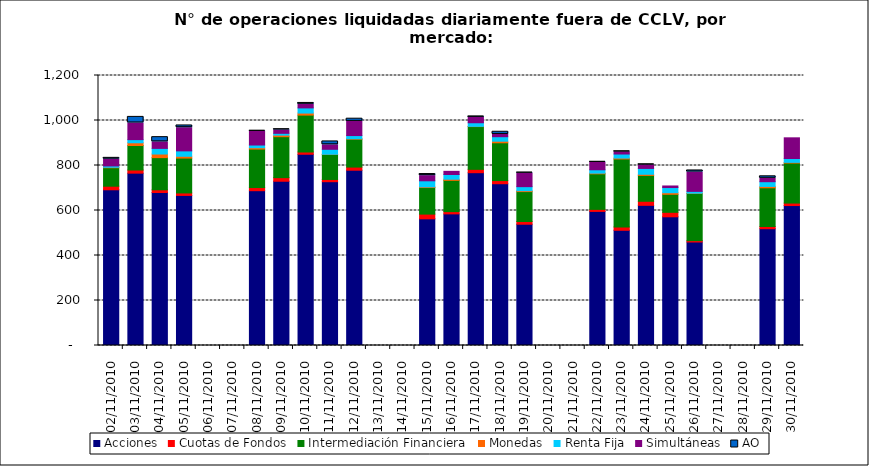
| Category | Acciones | Cuotas de Fondos | Intermediación Financiera | Monedas | Renta Fija | Simultáneas | AO |
|---|---|---|---|---|---|---|---|
| 02/11/2010 | 692 | 16 | 82 | 2 | 6 | 30 | 6 |
| 03/11/2010 | 766 | 14 | 109 | 12 | 14 | 74 | 27 |
| 04/11/2010 | 680 | 12 | 143 | 16 | 25 | 29 | 21 |
| 05/11/2010 | 667 | 11 | 155 | 8 | 24 | 103 | 10 |
| 08/11/2010 | 688 | 14 | 171 | 6 | 12 | 61 | 2 |
| 09/11/2010 | 730 | 16 | 182 | 7 | 8 | 15 | 3 |
| 10/11/2010 | 850 | 10 | 164 | 9 | 23 | 16 | 6 |
| 11/11/2010 | 728 | 10 | 111 | 1 | 22 | 20 | 15 |
| 12/11/2010 | 779 | 14 | 124 | 2 | 14 | 63 | 12 |
| 15/11/2010 | 563 | 21 | 118 | 3 | 27 | 23 | 7 |
| 16/11/2010 | 585 | 10 | 139 | 5 | 21 | 14 | 0 |
| 17/11/2010 | 768 | 15 | 190 | 1 | 16 | 24 | 4 |
| 18/11/2010 | 719 | 14 | 168 | 7 | 20 | 10 | 12 |
| 19/11/2010 | 539 | 12 | 133 | 4 | 18 | 60 | 2 |
| 22/11/2010 | 596 | 9 | 158 | 3 | 15 | 33 | 2 |
| 23/11/2010 | 512 | 15 | 302 | 4 | 18 | 10 | 1 |
| 24/11/2010 | 623 | 18 | 115 | 5 | 26 | 16 | 1 |
| 25/11/2010 | 572 | 20 | 80 | 7 | 23 | 7 | 0 |
| 26/11/2010 | 460 | 6 | 210 | 1 | 8 | 86 | 7 |
| 29/11/2010 | 519 | 10 | 172 | 6 | 21 | 15 | 9 |
| 30/11/2010 | 622 | 11 | 178 | 3 | 17 | 92 | 0 |